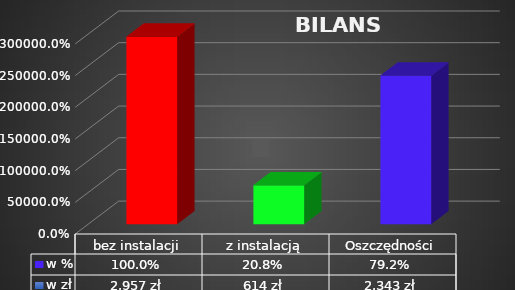
| Category | w zł | w % |
|---|---|---|
| bez instalacji | 2957.27 | 1 |
| z instalacją | 613.835 | 0.208 |
| Oszczędności | 2343.435 | 0.792 |